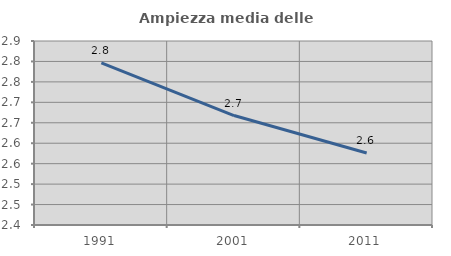
| Category | Ampiezza media delle famiglie |
|---|---|
| 1991.0 | 2.797 |
| 2001.0 | 2.668 |
| 2011.0 | 2.576 |